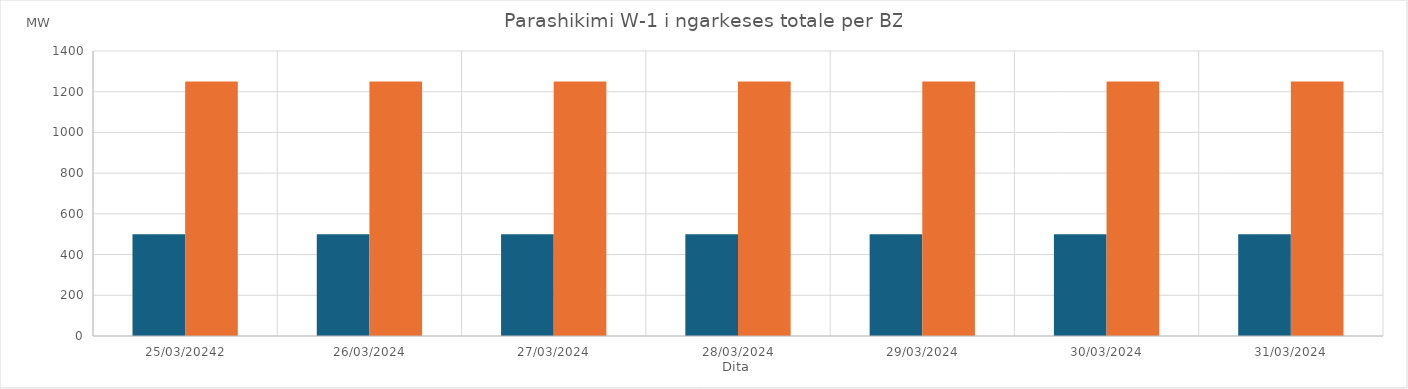
| Category | Min (MW) | Max (MW) |
|---|---|---|
| 25/03/20242 | 500 | 1250 |
| 26/03/2024 | 500 | 1250 |
| 27/03/2024 | 500 | 1250 |
| 28/03/2024 | 500 | 1250 |
| 29/03/2024 | 500 | 1250 |
| 30/03/2024 | 500 | 1250 |
| 31/03/2024 | 500 | 1250 |